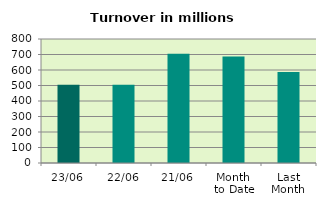
| Category | Series 0 |
|---|---|
| 23/06 | 505.494 |
| 22/06 | 504.147 |
| 21/06 | 705.364 |
| Month 
to Date | 687.068 |
| Last
Month | 587.249 |